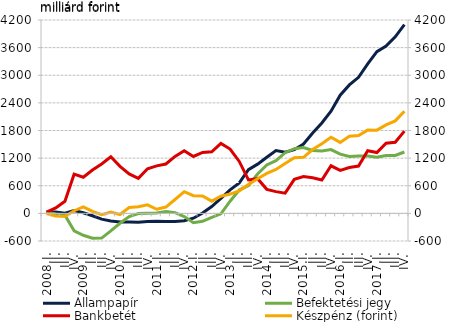
| Category | Állampapír  | Befektetési jegy  |
|---|---|---|
| 2008.I. | 22.215 | 26.165 |
| II. | 32.196 | -14.599 |
| III. | 3.655 | -38.376 |
| IV. | 58.993 | -379.05 |
| 2009.I. | 13.608 | -476.11 |
| II. | -50.936 | -540.979 |
| III. | -124.423 | -536.509 |
| IV. | -166.278 | -380.531 |
| 2010.I. | -187.825 | -213.951 |
| II. | -188.827 | -69.989 |
| III. | -192.032 | -3.064 |
| IV. | -177.74 | 5.307 |
| 2011.I. | -169.063 | 6.968 |
| II. | -175.678 | 38.963 |
| III. | -173.95 | 16.305 |
| IV. | -158.1 | -70.24 |
| 2012.I. | -104.526 | -202.446 |
| II. | 6.445 | -172.071 |
| III. | 148.428 | -89.3 |
| IV. | 326.618 | -10.203 |
| 2013.I. | 512.148 | 263.554 |
| II. | 662.178 | 506.175 |
| III. | 950.434 | 605.191 |
| IV. | 1068.977 | 855.499 |
| 2014.I. | 1219.915 | 1051.948 |
| II. | 1364.507 | 1145.231 |
| III. | 1327.264 | 1318.321 |
| IV. | 1382.463 | 1404.686 |
| 2015.I. | 1506.697 | 1428.23 |
| II. | 1746.659 | 1365.979 |
| III. | 1964.404 | 1353.345 |
| IV. | 2218.956 | 1386.365 |
| 2016.I. | 2567.788 | 1285.564 |
| II. | 2790.9 | 1237.106 |
| III. | 2955.272 | 1247.044 |
| IV. | 3246.51 | 1245.201 |
| 2017.I. | 3513.983 | 1219.035 |
| II. | 3631.932 | 1256.159 |
| III. | 3835.071 | 1259.364 |
| IV. | 4097.594 | 1332.878 |